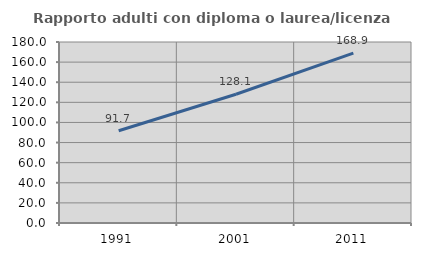
| Category | Rapporto adulti con diploma o laurea/licenza media  |
|---|---|
| 1991.0 | 91.687 |
| 2001.0 | 128.067 |
| 2011.0 | 168.876 |